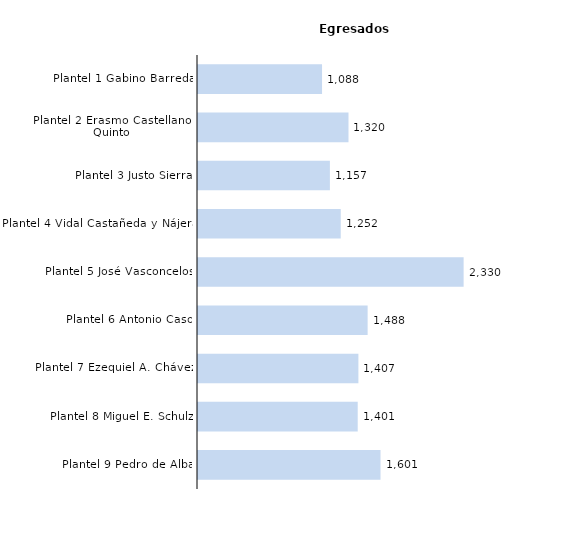
| Category | Series 0 |
|---|---|
| Plantel 9 Pedro de Alba | 1601 |
| Plantel 8 Miguel E. Schulz | 1401 |
| Plantel 7 Ezequiel A. Chávez | 1407 |
| Plantel 6 Antonio Caso | 1488 |
| Plantel 5 José Vasconcelos | 2330 |
| Plantel 4 Vidal Castañeda y Nájera | 1252 |
| Plantel 3 Justo Sierra | 1157 |
| Plantel 2 Erasmo Castellanos Quinto | 1320 |
| Plantel 1 Gabino Barreda | 1088 |